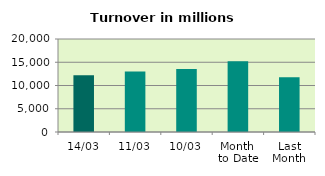
| Category | Series 0 |
|---|---|
| 14/03 | 12189.994 |
| 11/03 | 13031.048 |
| 10/03 | 13524.455 |
| Month 
to Date | 15240.698 |
| Last
Month | 11787.675 |